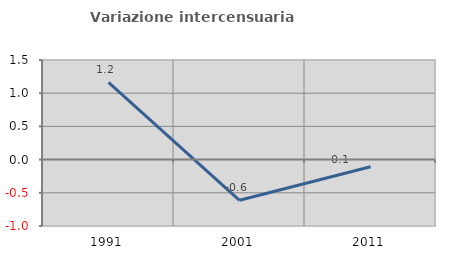
| Category | Variazione intercensuaria annua |
|---|---|
| 1991.0 | 1.164 |
| 2001.0 | -0.613 |
| 2011.0 | -0.108 |